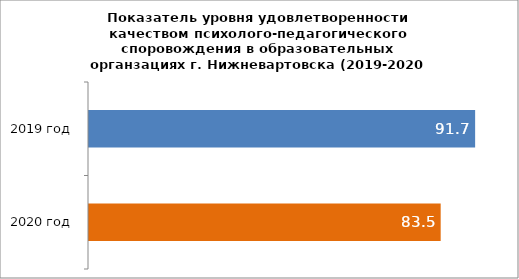
| Category | Series 0 |
|---|---|
| 2019 год | 91.718 |
| 2020 год | 83.534 |